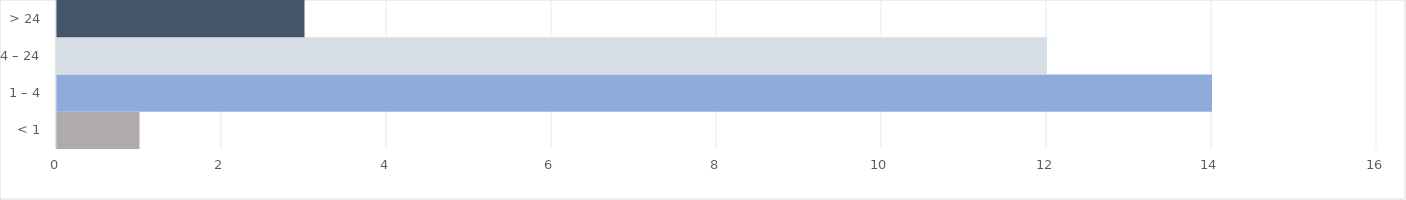
| Category | CALLS |
|---|---|
| < 1 | 1 |
| 1 – 4 | 14 |
| 4 – 24 | 12 |
| > 24 | 3 |